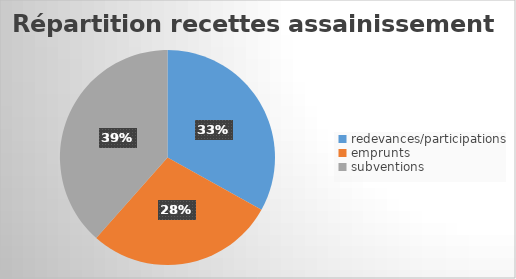
| Category | Series 0 |
|---|---|
| redevances/participations | 2331800 |
| emprunts | 2006335 |
| subventions | 2711300 |